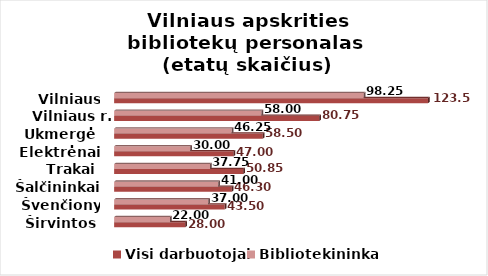
| Category | Visi darbuotojai | Bibliotekininkai |
|---|---|---|
| Širvintos | 28 | 22 |
| Švenčionys | 43.5 | 37 |
| Šalčininkai | 46.3 | 41 |
| Trakai | 50.85 | 37.75 |
| Elektrėnai | 47 | 30 |
| Ukmergė | 58.5 | 46.25 |
| Vilniaus r. | 80.75 | 58 |
| Vilniaus m. | 123.5 | 98.25 |